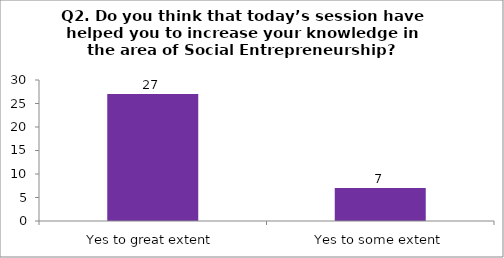
| Category | Q2. Do you think that today’s session have helped you to increase your knowledge in the area of Social Entrepreneurship? |
|---|---|
| Yes to great extent | 27 |
| Yes to some extent | 7 |